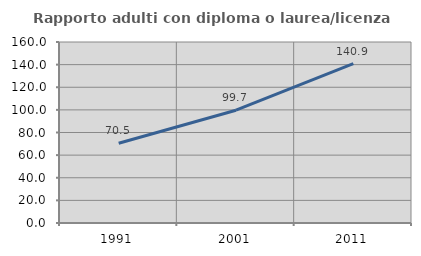
| Category | Rapporto adulti con diploma o laurea/licenza media  |
|---|---|
| 1991.0 | 70.53 |
| 2001.0 | 99.708 |
| 2011.0 | 140.921 |